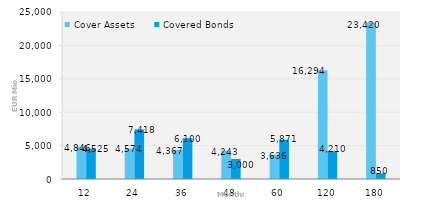
| Category | Cover Assets | Covered Bonds |
|---|---|---|
| 12.0 | 4845.613 | 4525 |
| 24.0 | 4573.795 | 7417.592 |
| 36.0 | 4366.674 | 6100 |
| 48.0 | 4243.212 | 3000 |
| 60.0 | 3636.221 | 5871.282 |
| 120.0 | 16294.18 | 4210.049 |
| 180.0 | 23419.983 | 850 |